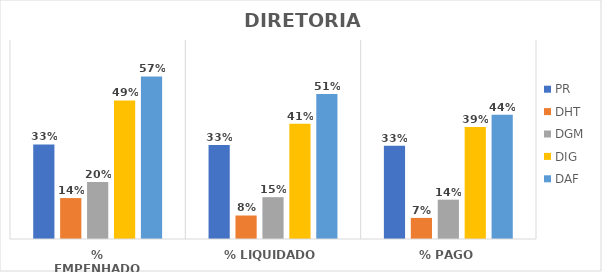
| Category | PR | DHT | DGM | DIG | DAF |
|---|---|---|---|---|---|
| % EMPENHADO | 0.333 | 0.144 | 0.201 | 0.488 | 0.572 |
| % LIQUIDADO | 0.331 | 0.083 | 0.147 | 0.406 | 0.51 |
| % PAGO | 0.328 | 0.074 | 0.138 | 0.394 | 0.437 |